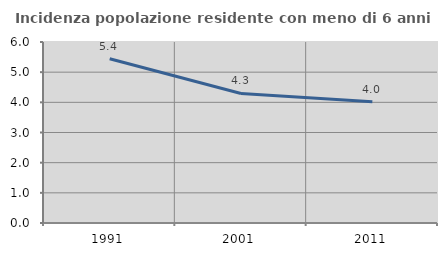
| Category | Incidenza popolazione residente con meno di 6 anni |
|---|---|
| 1991.0 | 5.446 |
| 2001.0 | 4.295 |
| 2011.0 | 4.017 |